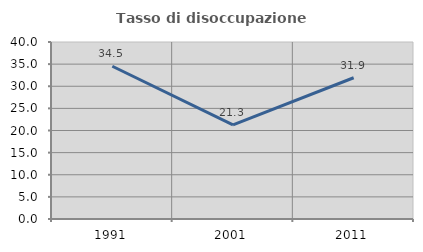
| Category | Tasso di disoccupazione giovanile  |
|---|---|
| 1991.0 | 34.516 |
| 2001.0 | 21.271 |
| 2011.0 | 31.926 |